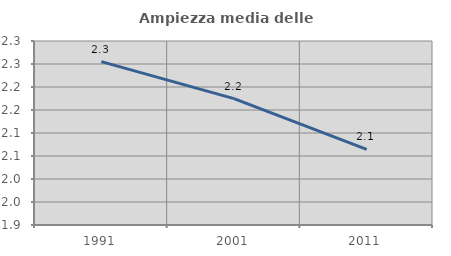
| Category | Ampiezza media delle famiglie |
|---|---|
| 1991.0 | 2.255 |
| 2001.0 | 2.175 |
| 2011.0 | 2.065 |